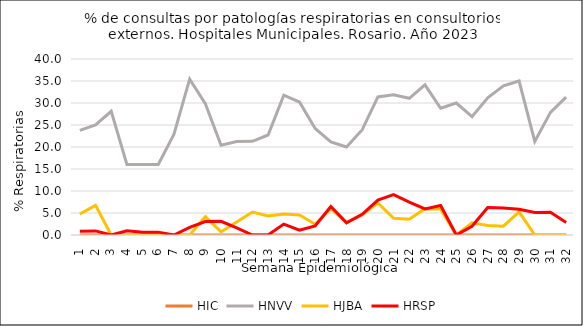
| Category | HIC | HNVV | HJBA | HRSP |
|---|---|---|---|---|
| 1.0 | 0 | 23.762 | 4.762 | 0.877 |
| 2.0 | 0 | 25 | 6.742 | 0.935 |
| 3.0 | 0 | 28.125 | 0 | 0 |
| 4.0 | 0 | 16.049 | 0 | 0.971 |
| 5.0 | 0 | 16.049 | 0 | 0.617 |
| 6.0 | 0 | 16.049 | 0 | 0.649 |
| 7.0 | 0 | 22.892 | 0 | 0 |
| 8.0 | 0 | 35.417 | 0 | 1.754 |
| 9.0 | 0 | 29.825 | 4.167 | 3.061 |
| 10.0 | 0 | 20.388 | 0.694 | 3.125 |
| 11.0 | 0 | 21.233 | 2.941 | 1.639 |
| 12.0 | 0 | 21.296 | 5.217 | 0 |
| 13.0 | 0 | 22.727 | 4.321 | 0 |
| 14.0 | 0 | 31.765 | 4.762 | 2.479 |
| 15.0 | 0 | 30.216 | 4.545 | 1.081 |
| 16.0 | 0 | 24.211 | 2.454 | 2.062 |
| 17.0 | 0 | 21.154 | 5.983 | 6.486 |
| 18.0 | 0 | 20 | 2.83 | 2.778 |
| 19.0 | 0 | 23.932 | 4.636 | 4.688 |
| 20.0 | 0 | 31.387 | 7.273 | 7.947 |
| 21.0 | 0 | 31.868 | 3.797 | 9.184 |
| 22.0 | 0 | 31.061 | 3.571 | 7.463 |
| 23.0 | 0 | 34.127 | 5.983 | 5.932 |
| 24.0 | 0 | 28.814 | 5.882 | 6.711 |
| 25.0 | 0 | 30 | 0 | 0 |
| 26.0 | 0 | 26.897 | 2.778 | 1.987 |
| 27.0 | 0 | 31.193 | 2.174 | 6.25 |
| 28.0 | 0 | 33.913 | 2 | 6.122 |
| 29.0 | 0 | 35 | 5.263 | 5.839 |
| 30.0 | 0 | 21.277 | 0 | 5.102 |
| 31.0 | 0 | 27.869 | 0 | 5.147 |
| 32.0 | 0 | 31.343 | 0 | 2.857 |